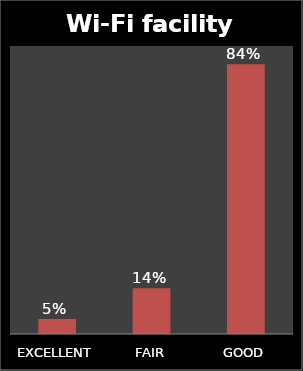
| Category | Series 0 |
|---|---|
| EXCELLENT | 0.047 |
| FAIR | 0.143 |
| GOOD | 0.843 |